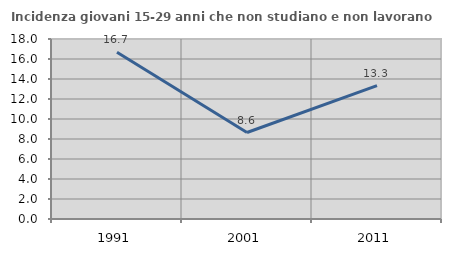
| Category | Incidenza giovani 15-29 anni che non studiano e non lavorano  |
|---|---|
| 1991.0 | 16.667 |
| 2001.0 | 8.649 |
| 2011.0 | 13.343 |